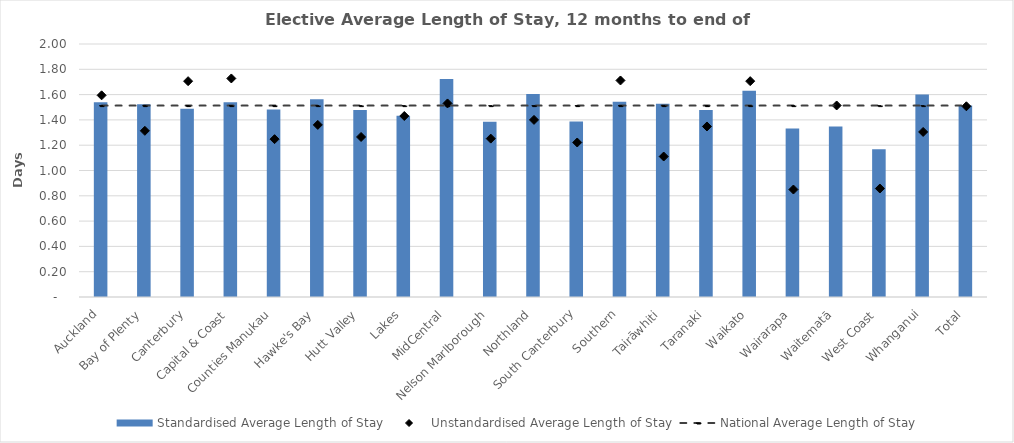
| Category | Standardised Average Length of Stay |
|---|---|
| Auckland | 1.54 |
| Bay of Plenty | 1.523 |
| Canterbury | 1.488 |
| Capital & Coast | 1.539 |
| Counties Manukau | 1.481 |
| Hawke's Bay | 1.564 |
| Hutt Valley | 1.478 |
| Lakes | 1.433 |
| MidCentral | 1.724 |
| Nelson Marlborough | 1.384 |
| Northland | 1.605 |
| South Canterbury | 1.387 |
| Southern | 1.544 |
| Tairāwhiti | 1.529 |
| Taranaki | 1.479 |
| Waikato | 1.63 |
| Wairarapa | 1.332 |
| Waitematā | 1.348 |
| West Coast | 1.168 |
| Whanganui | 1.601 |
| Total | 1.513 |